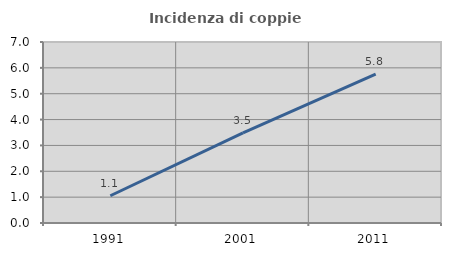
| Category | Incidenza di coppie miste |
|---|---|
| 1991.0 | 1.054 |
| 2001.0 | 3.487 |
| 2011.0 | 5.756 |